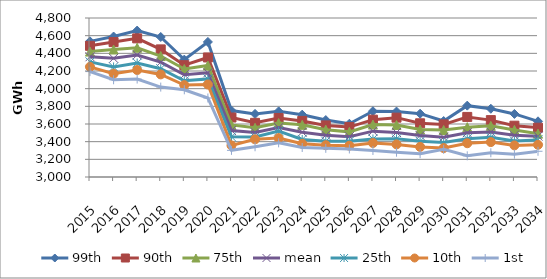
| Category | 99th | 90th | 75th | mean | 25th | 10th | 1st |
|---|---|---|---|---|---|---|---|
| 2015.0 | 4535.577 | 4484.898 | 4419.648 | 4361.394 | 4303.006 | 4246.941 | 4193.218 |
| 2016.0 | 4589.919 | 4527.24 | 4443.258 | 4343.516 | 4245.788 | 4168.932 | 4100.641 |
| 2017.0 | 4657.505 | 4569.57 | 4463.141 | 4381.534 | 4290.721 | 4211.011 | 4108.919 |
| 2018.0 | 4585.079 | 4444.671 | 4369.434 | 4299.997 | 4226.248 | 4161.453 | 4017.915 |
| 2019.0 | 4328.599 | 4265.649 | 4222.466 | 4157.726 | 4088.773 | 4040.438 | 3987.095 |
| 2020.0 | 4528.878 | 4353.374 | 4261.91 | 4179.898 | 4110.756 | 4047.138 | 3894.413 |
| 2021.0 | 3751.893 | 3673.254 | 3589.934 | 3526.027 | 3454.801 | 3357.948 | 3301.649 |
| 2022.0 | 3713.948 | 3613.153 | 3556.96 | 3505.07 | 3452.058 | 3426.49 | 3342.369 |
| 2023.0 | 3742.921 | 3668.388 | 3610.892 | 3559.056 | 3519.982 | 3440.668 | 3386.749 |
| 2024.0 | 3705.628 | 3634.791 | 3590.425 | 3507.756 | 3425.334 | 3376.147 | 3334.067 |
| 2025.0 | 3644.608 | 3584.045 | 3535.57 | 3473.773 | 3405.345 | 3359.987 | 3324.49 |
| 2026.0 | 3602.985 | 3565.2 | 3510.998 | 3457.013 | 3405.258 | 3354.491 | 3317.393 |
| 2027.0 | 3744.752 | 3649.033 | 3593.341 | 3519.034 | 3430.379 | 3385.012 | 3300.347 |
| 2028.0 | 3741.103 | 3671.925 | 3589.514 | 3503.619 | 3432.64 | 3368.926 | 3281.016 |
| 2029.0 | 3716.703 | 3607.997 | 3536.719 | 3469.139 | 3404.567 | 3340.931 | 3264.013 |
| 2030.0 | 3633.325 | 3595.614 | 3531.97 | 3450.199 | 3389.674 | 3327.622 | 3312.815 |
| 2031.0 | 3807.835 | 3680.297 | 3564.359 | 3501.108 | 3434.109 | 3382.226 | 3239.765 |
| 2032.0 | 3772.399 | 3644.054 | 3579.012 | 3508.699 | 3449.314 | 3395.043 | 3274.467 |
| 2033.0 | 3713.998 | 3580.808 | 3533.181 | 3472.217 | 3406.91 | 3357.963 | 3258.161 |
| 2034.0 | 3630.292 | 3558.213 | 3490.764 | 3462.241 | 3420.824 | 3364.676 | 3291.276 |